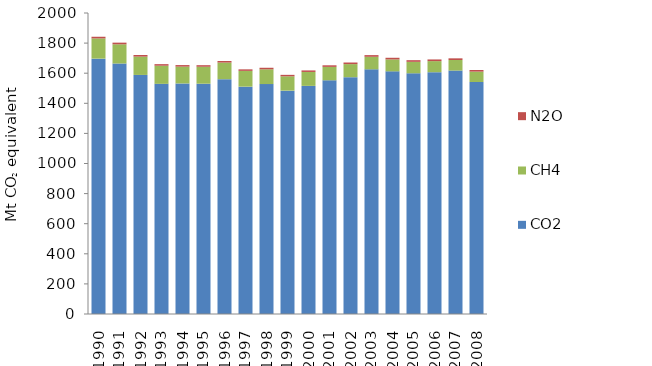
| Category | CO2 | CH4 | N2O |
|---|---|---|---|
| 1990 | 1696.775 | 134.368 | 11.023 |
| 1991 | 1664.352 | 127.592 | 11.083 |
| 1992 | 1588.445 | 121.719 | 10.741 |
| 1993 | 1529.359 | 120.495 | 10.337 |
| 1994 | 1531.905 | 111.715 | 10.359 |
| 1995 | 1530.208 | 112.741 | 10.283 |
| 1996 | 1560.23 | 110.391 | 10.642 |
| 1997 | 1510.643 | 104.862 | 10.083 |
| 1998 | 1527.805 | 98.027 | 10.28 |
| 1999 | 1484.136 | 95.026 | 9.856 |
| 2000 | 1515.746 | 92.578 | 10.145 |
| 2001 | 1552.791 | 89.249 | 10.45 |
| 2002 | 1573.457 | 86.954 | 10.639 |
| 2003 | 1625.722 | 83.39 | 11.061 |
| 2004 | 1612.253 | 79.308 | 10.945 |
| 2005 | 1599.416 | 76.175 | 10.916 |
| 2006 | 1606.635 | 73.629 | 11.095 |
| 2007 | 1617.471 | 70.149 | 11.15 |
| 2008 | 1541.341 | 69.13 | 10.758 |